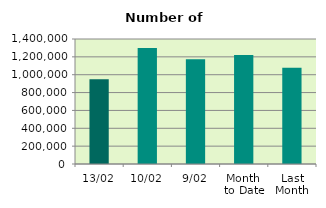
| Category | Series 0 |
|---|---|
| 13/02 | 948460 |
| 10/02 | 1299024 |
| 9/02 | 1174070 |
| Month 
to Date | 1221014.889 |
| Last
Month | 1077187.636 |